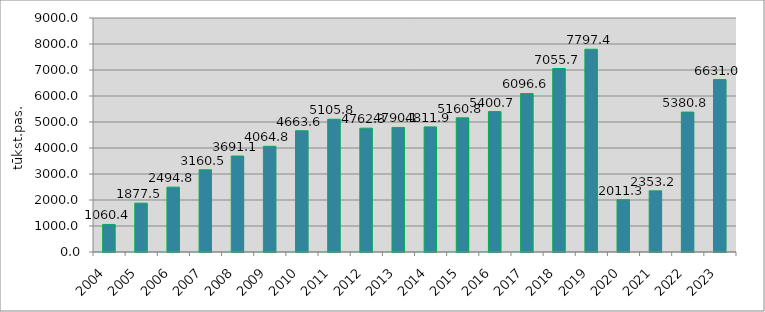
| Category | Series 0 |
|---|---|
| 2004.0 | 1060.384 |
| 2005.0 | 1877.461 |
| 2006.0 | 2494.835 |
| 2007.0 | 3160.535 |
| 2008.0 | 3691.099 |
| 2009.0 | 4064.755 |
| 2010.0 | 4663.647 |
| 2011.0 | 5105.818 |
| 2012.0 | 4762.335 |
| 2013.0 | 4790.136 |
| 2014.0 | 4811.949 |
| 2015.0 | 5160.759 |
| 2016.0 | 5400.709 |
| 2017.0 | 6096.62 |
| 2018.0 | 7055.734 |
| 2019.0 | 7797.4 |
| 2020.0 | 2011.3 |
| 2021.0 | 2353.2 |
| 2022.0 | 5380.8 |
| 2023.0 | 6631 |